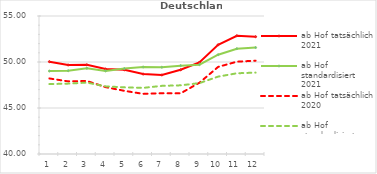
| Category | ab Hof tatsächlich 2021 | ab Hof standardisiert 2021 | ab Hof tatsächlich 2020 | ab Hof standardisiert 2020 |
|---|---|---|---|---|
| 0 | 50.037 | 49.015 | 48.212 | 47.6 |
| 1 | 49.674 | 49.047 | 47.893 | 47.65 |
| 2 | 49.692 | 49.322 | 47.938 | 47.761 |
| 3 | 49.231 | 49.03 | 47.267 | 47.353 |
| 4 | 49.154 | 49.283 | 46.866 | 47.244 |
| 5 | 48.687 | 49.457 | 46.538 | 47.187 |
| 6 | 48.59 | 49.436 | 46.606 | 47.407 |
| 7 | 49.154 | 49.605 | 46.595 | 47.464 |
| 8 | 49.955 | 49.71 | 47.742 | 47.703 |
| 9 | 51.869 | 50.79 | 49.467 | 48.412 |
| 10 | 52.851 | 51.445 | 50.034 | 48.775 |
| 11 | 52.749 | 51.571 | 50.146 | 48.846 |